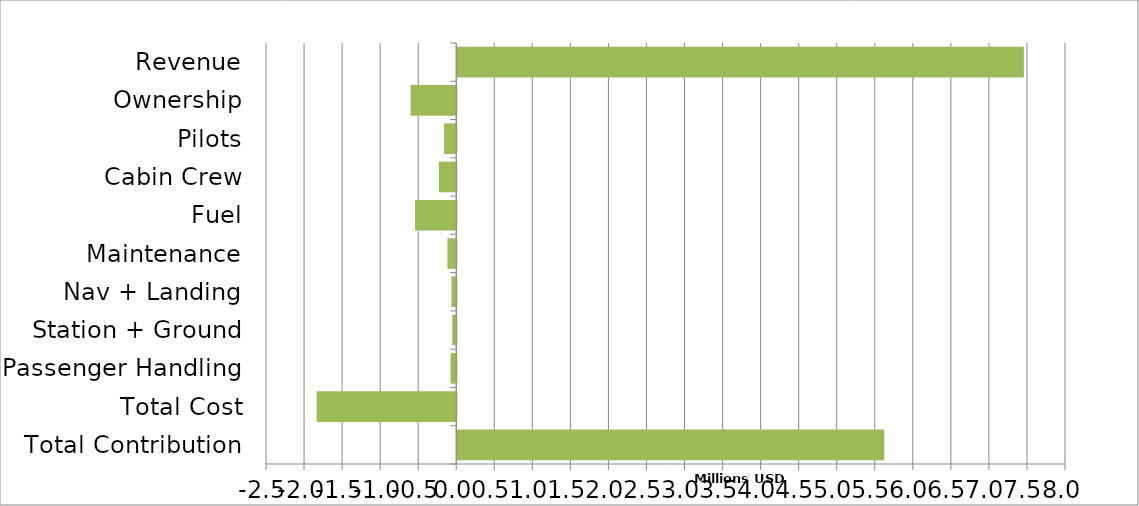
| Category | Difference |
|---|---|
| Total Contribution | 5611697.75 |
| Total Cost | -1834302.25 |
| Passenger Handling | -74460 |
| Station + Ground | -52158.5 |
| Nav + Landing | -63236.25 |
| Maintenance | -115978.75 |
| Fuel | -540656.25 |
| Cabin Crew | -228125 |
| Pilots | -159687.5 |
| Ownership | -600000 |
| Revenue | 7446000 |